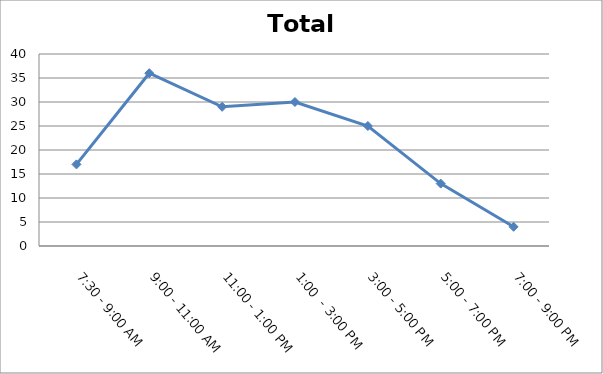
| Category | Total |
|---|---|
| 7:30 - 9:00 AM | 17 |
| 9:00 - 11:00 AM | 36 |
| 11:00 - 1:00 PM | 29 |
| 1:00  - 3:00 PM | 30 |
| 3:00 - 5:00 PM | 25 |
| 5:00 - 7:00 PM | 13 |
| 7:00 - 9:00 PM | 4 |